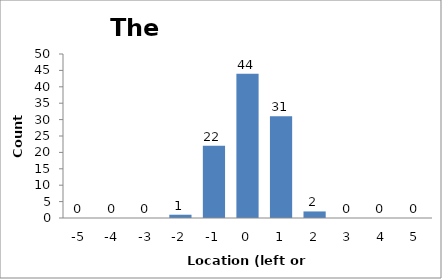
| Category | Series 0 |
|---|---|
| -5.0 | 0 |
| -4.0 | 0 |
| -3.0 | 0 |
| -2.0 | 1 |
| -1.0 | 22 |
| 0.0 | 44 |
| 1.0 | 31 |
| 2.0 | 2 |
| 3.0 | 0 |
| 4.0 | 0 |
| 5.0 | 0 |